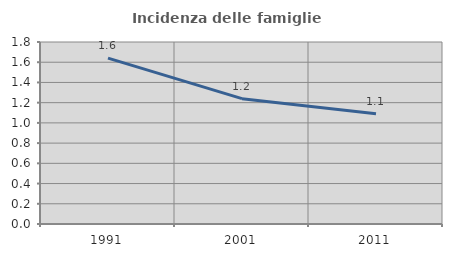
| Category | Incidenza delle famiglie numerose |
|---|---|
| 1991.0 | 1.641 |
| 2001.0 | 1.239 |
| 2011.0 | 1.091 |